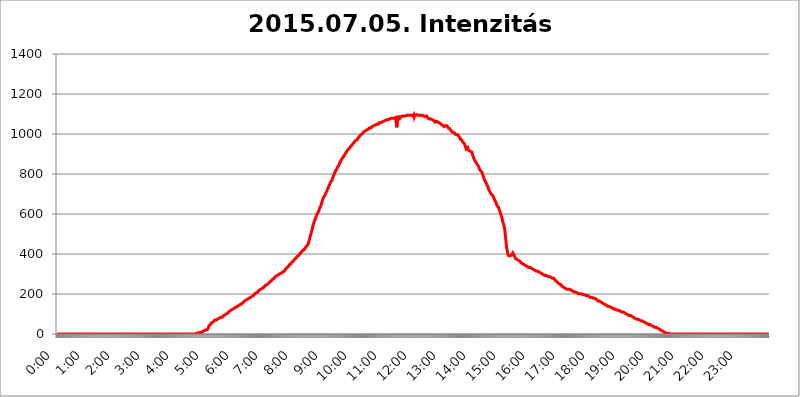
| Category | 2015.07.05. Intenzitás [W/m^2] |
|---|---|
| 0.0 | 0 |
| 0.0006944444444444445 | 0 |
| 0.001388888888888889 | 0 |
| 0.0020833333333333333 | 0 |
| 0.002777777777777778 | 0 |
| 0.003472222222222222 | 0 |
| 0.004166666666666667 | 0 |
| 0.004861111111111111 | 0 |
| 0.005555555555555556 | 0 |
| 0.0062499999999999995 | 0 |
| 0.006944444444444444 | 0 |
| 0.007638888888888889 | 0 |
| 0.008333333333333333 | 0 |
| 0.009027777777777779 | 0 |
| 0.009722222222222222 | 0 |
| 0.010416666666666666 | 0 |
| 0.011111111111111112 | 0 |
| 0.011805555555555555 | 0 |
| 0.012499999999999999 | 0 |
| 0.013194444444444444 | 0 |
| 0.013888888888888888 | 0 |
| 0.014583333333333332 | 0 |
| 0.015277777777777777 | 0 |
| 0.015972222222222224 | 0 |
| 0.016666666666666666 | 0 |
| 0.017361111111111112 | 0 |
| 0.018055555555555557 | 0 |
| 0.01875 | 0 |
| 0.019444444444444445 | 0 |
| 0.02013888888888889 | 0 |
| 0.020833333333333332 | 0 |
| 0.02152777777777778 | 0 |
| 0.022222222222222223 | 0 |
| 0.02291666666666667 | 0 |
| 0.02361111111111111 | 0 |
| 0.024305555555555556 | 0 |
| 0.024999999999999998 | 0 |
| 0.025694444444444447 | 0 |
| 0.02638888888888889 | 0 |
| 0.027083333333333334 | 0 |
| 0.027777777777777776 | 0 |
| 0.02847222222222222 | 0 |
| 0.029166666666666664 | 0 |
| 0.029861111111111113 | 0 |
| 0.030555555555555555 | 0 |
| 0.03125 | 0 |
| 0.03194444444444445 | 0 |
| 0.03263888888888889 | 0 |
| 0.03333333333333333 | 0 |
| 0.034027777777777775 | 0 |
| 0.034722222222222224 | 0 |
| 0.035416666666666666 | 0 |
| 0.036111111111111115 | 0 |
| 0.03680555555555556 | 0 |
| 0.0375 | 0 |
| 0.03819444444444444 | 0 |
| 0.03888888888888889 | 0 |
| 0.03958333333333333 | 0 |
| 0.04027777777777778 | 0 |
| 0.04097222222222222 | 0 |
| 0.041666666666666664 | 0 |
| 0.042361111111111106 | 0 |
| 0.04305555555555556 | 0 |
| 0.043750000000000004 | 0 |
| 0.044444444444444446 | 0 |
| 0.04513888888888889 | 0 |
| 0.04583333333333334 | 0 |
| 0.04652777777777778 | 0 |
| 0.04722222222222222 | 0 |
| 0.04791666666666666 | 0 |
| 0.04861111111111111 | 0 |
| 0.049305555555555554 | 0 |
| 0.049999999999999996 | 0 |
| 0.05069444444444445 | 0 |
| 0.051388888888888894 | 0 |
| 0.052083333333333336 | 0 |
| 0.05277777777777778 | 0 |
| 0.05347222222222222 | 0 |
| 0.05416666666666667 | 0 |
| 0.05486111111111111 | 0 |
| 0.05555555555555555 | 0 |
| 0.05625 | 0 |
| 0.05694444444444444 | 0 |
| 0.057638888888888885 | 0 |
| 0.05833333333333333 | 0 |
| 0.05902777777777778 | 0 |
| 0.059722222222222225 | 0 |
| 0.06041666666666667 | 0 |
| 0.061111111111111116 | 0 |
| 0.06180555555555556 | 0 |
| 0.0625 | 0 |
| 0.06319444444444444 | 0 |
| 0.06388888888888888 | 0 |
| 0.06458333333333334 | 0 |
| 0.06527777777777778 | 0 |
| 0.06597222222222222 | 0 |
| 0.06666666666666667 | 0 |
| 0.06736111111111111 | 0 |
| 0.06805555555555555 | 0 |
| 0.06874999999999999 | 0 |
| 0.06944444444444443 | 0 |
| 0.07013888888888889 | 0 |
| 0.07083333333333333 | 0 |
| 0.07152777777777779 | 0 |
| 0.07222222222222223 | 0 |
| 0.07291666666666667 | 0 |
| 0.07361111111111111 | 0 |
| 0.07430555555555556 | 0 |
| 0.075 | 0 |
| 0.07569444444444444 | 0 |
| 0.0763888888888889 | 0 |
| 0.07708333333333334 | 0 |
| 0.07777777777777778 | 0 |
| 0.07847222222222222 | 0 |
| 0.07916666666666666 | 0 |
| 0.0798611111111111 | 0 |
| 0.08055555555555556 | 0 |
| 0.08125 | 0 |
| 0.08194444444444444 | 0 |
| 0.08263888888888889 | 0 |
| 0.08333333333333333 | 0 |
| 0.08402777777777777 | 0 |
| 0.08472222222222221 | 0 |
| 0.08541666666666665 | 0 |
| 0.08611111111111112 | 0 |
| 0.08680555555555557 | 0 |
| 0.08750000000000001 | 0 |
| 0.08819444444444445 | 0 |
| 0.08888888888888889 | 0 |
| 0.08958333333333333 | 0 |
| 0.09027777777777778 | 0 |
| 0.09097222222222222 | 0 |
| 0.09166666666666667 | 0 |
| 0.09236111111111112 | 0 |
| 0.09305555555555556 | 0 |
| 0.09375 | 0 |
| 0.09444444444444444 | 0 |
| 0.09513888888888888 | 0 |
| 0.09583333333333333 | 0 |
| 0.09652777777777777 | 0 |
| 0.09722222222222222 | 0 |
| 0.09791666666666667 | 0 |
| 0.09861111111111111 | 0 |
| 0.09930555555555555 | 0 |
| 0.09999999999999999 | 0 |
| 0.10069444444444443 | 0 |
| 0.1013888888888889 | 0 |
| 0.10208333333333335 | 0 |
| 0.10277777777777779 | 0 |
| 0.10347222222222223 | 0 |
| 0.10416666666666667 | 0 |
| 0.10486111111111111 | 0 |
| 0.10555555555555556 | 0 |
| 0.10625 | 0 |
| 0.10694444444444444 | 0 |
| 0.1076388888888889 | 0 |
| 0.10833333333333334 | 0 |
| 0.10902777777777778 | 0 |
| 0.10972222222222222 | 0 |
| 0.1111111111111111 | 0 |
| 0.11180555555555556 | 0 |
| 0.11180555555555556 | 0 |
| 0.1125 | 0 |
| 0.11319444444444444 | 0 |
| 0.11388888888888889 | 0 |
| 0.11458333333333333 | 0 |
| 0.11527777777777777 | 0 |
| 0.11597222222222221 | 0 |
| 0.11666666666666665 | 0 |
| 0.1173611111111111 | 0 |
| 0.11805555555555557 | 0 |
| 0.11944444444444445 | 0 |
| 0.12013888888888889 | 0 |
| 0.12083333333333333 | 0 |
| 0.12152777777777778 | 0 |
| 0.12222222222222223 | 0 |
| 0.12291666666666667 | 0 |
| 0.12291666666666667 | 0 |
| 0.12361111111111112 | 0 |
| 0.12430555555555556 | 0 |
| 0.125 | 0 |
| 0.12569444444444444 | 0 |
| 0.12638888888888888 | 0 |
| 0.12708333333333333 | 0 |
| 0.16875 | 0 |
| 0.12847222222222224 | 0 |
| 0.12916666666666668 | 0 |
| 0.12986111111111112 | 0 |
| 0.13055555555555556 | 0 |
| 0.13125 | 0 |
| 0.13194444444444445 | 0 |
| 0.1326388888888889 | 0 |
| 0.13333333333333333 | 0 |
| 0.13402777777777777 | 0 |
| 0.13402777777777777 | 0 |
| 0.13472222222222222 | 0 |
| 0.13541666666666666 | 0 |
| 0.1361111111111111 | 0 |
| 0.13749999999999998 | 0 |
| 0.13819444444444443 | 0 |
| 0.1388888888888889 | 0 |
| 0.13958333333333334 | 0 |
| 0.14027777777777778 | 0 |
| 0.14097222222222222 | 0 |
| 0.14166666666666666 | 0 |
| 0.1423611111111111 | 0 |
| 0.14305555555555557 | 0 |
| 0.14375000000000002 | 0 |
| 0.14444444444444446 | 0 |
| 0.1451388888888889 | 0 |
| 0.1451388888888889 | 0 |
| 0.14652777777777778 | 0 |
| 0.14722222222222223 | 0 |
| 0.14791666666666667 | 0 |
| 0.1486111111111111 | 0 |
| 0.14930555555555555 | 0 |
| 0.15 | 0 |
| 0.15069444444444444 | 0 |
| 0.15138888888888888 | 0 |
| 0.15208333333333332 | 0 |
| 0.15277777777777776 | 0 |
| 0.15347222222222223 | 0 |
| 0.15416666666666667 | 0 |
| 0.15486111111111112 | 0 |
| 0.15555555555555556 | 0 |
| 0.15625 | 0 |
| 0.15694444444444444 | 0 |
| 0.15763888888888888 | 0 |
| 0.15833333333333333 | 0 |
| 0.15902777777777777 | 0 |
| 0.15972222222222224 | 0 |
| 0.16041666666666668 | 0 |
| 0.16111111111111112 | 0 |
| 0.16180555555555556 | 0 |
| 0.1625 | 0 |
| 0.16319444444444445 | 0 |
| 0.1638888888888889 | 0 |
| 0.16458333333333333 | 0 |
| 0.16527777777777777 | 0 |
| 0.16597222222222222 | 0 |
| 0.16666666666666666 | 0 |
| 0.1673611111111111 | 0 |
| 0.16805555555555554 | 0 |
| 0.16874999999999998 | 0 |
| 0.16944444444444443 | 0 |
| 0.17013888888888887 | 0 |
| 0.1708333333333333 | 0 |
| 0.17152777777777775 | 0 |
| 0.17222222222222225 | 0 |
| 0.1729166666666667 | 0 |
| 0.17361111111111113 | 0 |
| 0.17430555555555557 | 0 |
| 0.17500000000000002 | 0 |
| 0.17569444444444446 | 0 |
| 0.1763888888888889 | 0 |
| 0.17708333333333334 | 0 |
| 0.17777777777777778 | 0 |
| 0.17847222222222223 | 0 |
| 0.17916666666666667 | 0 |
| 0.1798611111111111 | 0 |
| 0.18055555555555555 | 0 |
| 0.18125 | 0 |
| 0.18194444444444444 | 0 |
| 0.1826388888888889 | 0 |
| 0.18333333333333335 | 0 |
| 0.1840277777777778 | 0 |
| 0.18472222222222223 | 0 |
| 0.18541666666666667 | 0 |
| 0.18611111111111112 | 0 |
| 0.18680555555555556 | 0 |
| 0.1875 | 0 |
| 0.18819444444444444 | 0 |
| 0.18888888888888888 | 0 |
| 0.18958333333333333 | 0 |
| 0.19027777777777777 | 0 |
| 0.1909722222222222 | 0 |
| 0.19166666666666665 | 0 |
| 0.19236111111111112 | 0 |
| 0.19305555555555554 | 0 |
| 0.19375 | 0 |
| 0.19444444444444445 | 3.525 |
| 0.1951388888888889 | 3.525 |
| 0.19583333333333333 | 3.525 |
| 0.19652777777777777 | 3.525 |
| 0.19722222222222222 | 3.525 |
| 0.19791666666666666 | 3.525 |
| 0.1986111111111111 | 3.525 |
| 0.19930555555555554 | 3.525 |
| 0.19999999999999998 | 7.887 |
| 0.20069444444444443 | 7.887 |
| 0.20138888888888887 | 7.887 |
| 0.2020833333333333 | 7.887 |
| 0.2027777777777778 | 12.257 |
| 0.2034722222222222 | 12.257 |
| 0.2041666666666667 | 12.257 |
| 0.20486111111111113 | 12.257 |
| 0.20555555555555557 | 12.257 |
| 0.20625000000000002 | 16.636 |
| 0.20694444444444446 | 16.636 |
| 0.2076388888888889 | 16.636 |
| 0.20833333333333334 | 21.024 |
| 0.20902777777777778 | 21.024 |
| 0.20972222222222223 | 21.024 |
| 0.21041666666666667 | 21.024 |
| 0.2111111111111111 | 25.419 |
| 0.21180555555555555 | 29.823 |
| 0.2125 | 38.653 |
| 0.21319444444444444 | 43.079 |
| 0.2138888888888889 | 43.079 |
| 0.21458333333333335 | 47.511 |
| 0.2152777777777778 | 47.511 |
| 0.21597222222222223 | 51.951 |
| 0.21666666666666667 | 56.398 |
| 0.21736111111111112 | 56.398 |
| 0.21805555555555556 | 60.85 |
| 0.21875 | 60.85 |
| 0.21944444444444444 | 65.31 |
| 0.22013888888888888 | 65.31 |
| 0.22083333333333333 | 69.775 |
| 0.22152777777777777 | 69.775 |
| 0.2222222222222222 | 69.775 |
| 0.22291666666666665 | 69.775 |
| 0.2236111111111111 | 74.246 |
| 0.22430555555555556 | 74.246 |
| 0.225 | 74.246 |
| 0.22569444444444445 | 74.246 |
| 0.2263888888888889 | 78.722 |
| 0.22708333333333333 | 78.722 |
| 0.22777777777777777 | 78.722 |
| 0.22847222222222222 | 78.722 |
| 0.22916666666666666 | 83.205 |
| 0.2298611111111111 | 83.205 |
| 0.23055555555555554 | 83.205 |
| 0.23124999999999998 | 83.205 |
| 0.23194444444444443 | 87.692 |
| 0.23263888888888887 | 87.692 |
| 0.2333333333333333 | 92.184 |
| 0.2340277777777778 | 92.184 |
| 0.2347222222222222 | 92.184 |
| 0.2354166666666667 | 96.682 |
| 0.23611111111111113 | 96.682 |
| 0.23680555555555557 | 101.184 |
| 0.23750000000000002 | 101.184 |
| 0.23819444444444446 | 105.69 |
| 0.2388888888888889 | 105.69 |
| 0.23958333333333334 | 105.69 |
| 0.24027777777777778 | 110.201 |
| 0.24097222222222223 | 110.201 |
| 0.24166666666666667 | 114.716 |
| 0.2423611111111111 | 114.716 |
| 0.24305555555555555 | 119.235 |
| 0.24375 | 119.235 |
| 0.24444444444444446 | 119.235 |
| 0.24513888888888888 | 119.235 |
| 0.24583333333333335 | 123.758 |
| 0.2465277777777778 | 123.758 |
| 0.24722222222222223 | 123.758 |
| 0.24791666666666667 | 128.284 |
| 0.24861111111111112 | 128.284 |
| 0.24930555555555556 | 128.284 |
| 0.25 | 132.814 |
| 0.25069444444444444 | 132.814 |
| 0.2513888888888889 | 137.347 |
| 0.2520833333333333 | 137.347 |
| 0.25277777777777777 | 137.347 |
| 0.2534722222222222 | 141.884 |
| 0.25416666666666665 | 141.884 |
| 0.2548611111111111 | 146.423 |
| 0.2555555555555556 | 146.423 |
| 0.25625000000000003 | 146.423 |
| 0.2569444444444445 | 150.964 |
| 0.2576388888888889 | 150.964 |
| 0.25833333333333336 | 150.964 |
| 0.2590277777777778 | 155.509 |
| 0.25972222222222224 | 155.509 |
| 0.2604166666666667 | 155.509 |
| 0.2611111111111111 | 160.056 |
| 0.26180555555555557 | 160.056 |
| 0.2625 | 164.605 |
| 0.26319444444444445 | 164.605 |
| 0.2638888888888889 | 164.605 |
| 0.26458333333333334 | 169.156 |
| 0.2652777777777778 | 169.156 |
| 0.2659722222222222 | 169.156 |
| 0.26666666666666666 | 173.709 |
| 0.2673611111111111 | 173.709 |
| 0.26805555555555555 | 173.709 |
| 0.26875 | 178.264 |
| 0.26944444444444443 | 178.264 |
| 0.2701388888888889 | 182.82 |
| 0.2708333333333333 | 182.82 |
| 0.27152777777777776 | 182.82 |
| 0.2722222222222222 | 182.82 |
| 0.27291666666666664 | 187.378 |
| 0.2736111111111111 | 191.937 |
| 0.2743055555555555 | 191.937 |
| 0.27499999999999997 | 191.937 |
| 0.27569444444444446 | 196.497 |
| 0.27638888888888885 | 196.497 |
| 0.27708333333333335 | 201.058 |
| 0.2777777777777778 | 201.058 |
| 0.27847222222222223 | 201.058 |
| 0.2791666666666667 | 205.62 |
| 0.2798611111111111 | 205.62 |
| 0.28055555555555556 | 210.182 |
| 0.28125 | 210.182 |
| 0.28194444444444444 | 214.746 |
| 0.2826388888888889 | 214.746 |
| 0.2833333333333333 | 219.309 |
| 0.28402777777777777 | 219.309 |
| 0.2847222222222222 | 219.309 |
| 0.28541666666666665 | 223.873 |
| 0.28611111111111115 | 223.873 |
| 0.28680555555555554 | 228.436 |
| 0.28750000000000003 | 228.436 |
| 0.2881944444444445 | 233 |
| 0.2888888888888889 | 233 |
| 0.28958333333333336 | 233 |
| 0.2902777777777778 | 237.564 |
| 0.29097222222222224 | 237.564 |
| 0.2916666666666667 | 242.127 |
| 0.2923611111111111 | 242.127 |
| 0.29305555555555557 | 246.689 |
| 0.29375 | 246.689 |
| 0.29444444444444445 | 246.689 |
| 0.2951388888888889 | 251.251 |
| 0.29583333333333334 | 251.251 |
| 0.2965277777777778 | 255.813 |
| 0.2972222222222222 | 255.813 |
| 0.29791666666666666 | 260.373 |
| 0.2986111111111111 | 260.373 |
| 0.29930555555555555 | 264.932 |
| 0.3 | 264.932 |
| 0.30069444444444443 | 269.49 |
| 0.3013888888888889 | 269.49 |
| 0.3020833333333333 | 274.047 |
| 0.30277777777777776 | 274.047 |
| 0.3034722222222222 | 278.603 |
| 0.30416666666666664 | 278.603 |
| 0.3048611111111111 | 283.156 |
| 0.3055555555555555 | 283.156 |
| 0.30624999999999997 | 287.709 |
| 0.3069444444444444 | 287.709 |
| 0.3076388888888889 | 287.709 |
| 0.30833333333333335 | 292.259 |
| 0.3090277777777778 | 292.259 |
| 0.30972222222222223 | 292.259 |
| 0.3104166666666667 | 296.808 |
| 0.3111111111111111 | 296.808 |
| 0.31180555555555556 | 296.808 |
| 0.3125 | 301.354 |
| 0.31319444444444444 | 301.354 |
| 0.3138888888888889 | 305.898 |
| 0.3145833333333333 | 305.898 |
| 0.31527777777777777 | 305.898 |
| 0.3159722222222222 | 310.44 |
| 0.31666666666666665 | 310.44 |
| 0.31736111111111115 | 314.98 |
| 0.31805555555555554 | 314.98 |
| 0.31875000000000003 | 314.98 |
| 0.3194444444444445 | 319.517 |
| 0.3201388888888889 | 324.052 |
| 0.32083333333333336 | 324.052 |
| 0.3215277777777778 | 328.584 |
| 0.32222222222222224 | 333.113 |
| 0.3229166666666667 | 333.113 |
| 0.3236111111111111 | 337.639 |
| 0.32430555555555557 | 337.639 |
| 0.325 | 342.162 |
| 0.32569444444444445 | 346.682 |
| 0.3263888888888889 | 346.682 |
| 0.32708333333333334 | 351.198 |
| 0.3277777777777778 | 351.198 |
| 0.3284722222222222 | 355.712 |
| 0.32916666666666666 | 360.221 |
| 0.3298611111111111 | 360.221 |
| 0.33055555555555555 | 364.728 |
| 0.33125 | 364.728 |
| 0.33194444444444443 | 369.23 |
| 0.3326388888888889 | 373.729 |
| 0.3333333333333333 | 378.224 |
| 0.3340277777777778 | 378.224 |
| 0.3347222222222222 | 378.224 |
| 0.3354166666666667 | 382.715 |
| 0.3361111111111111 | 387.202 |
| 0.3368055555555556 | 387.202 |
| 0.33749999999999997 | 391.685 |
| 0.33819444444444446 | 391.685 |
| 0.33888888888888885 | 396.164 |
| 0.33958333333333335 | 396.164 |
| 0.34027777777777773 | 400.638 |
| 0.34097222222222223 | 405.108 |
| 0.3416666666666666 | 405.108 |
| 0.3423611111111111 | 409.574 |
| 0.3430555555555555 | 414.035 |
| 0.34375 | 414.035 |
| 0.3444444444444445 | 418.492 |
| 0.3451388888888889 | 418.492 |
| 0.3458333333333334 | 422.943 |
| 0.34652777777777777 | 422.943 |
| 0.34722222222222227 | 427.39 |
| 0.34791666666666665 | 431.833 |
| 0.34861111111111115 | 431.833 |
| 0.34930555555555554 | 436.27 |
| 0.35000000000000003 | 440.702 |
| 0.3506944444444444 | 440.702 |
| 0.3513888888888889 | 445.129 |
| 0.3520833333333333 | 449.551 |
| 0.3527777777777778 | 462.786 |
| 0.3534722222222222 | 467.187 |
| 0.3541666666666667 | 475.972 |
| 0.3548611111111111 | 489.108 |
| 0.35555555555555557 | 497.836 |
| 0.35625 | 506.542 |
| 0.35694444444444445 | 515.223 |
| 0.3576388888888889 | 523.88 |
| 0.35833333333333334 | 536.82 |
| 0.3590277777777778 | 545.416 |
| 0.3597222222222222 | 553.986 |
| 0.36041666666666666 | 562.53 |
| 0.3611111111111111 | 566.793 |
| 0.36180555555555555 | 575.299 |
| 0.3625 | 579.542 |
| 0.36319444444444443 | 588.009 |
| 0.3638888888888889 | 592.233 |
| 0.3645833333333333 | 600.661 |
| 0.3652777777777778 | 600.661 |
| 0.3659722222222222 | 604.864 |
| 0.3666666666666667 | 613.252 |
| 0.3673611111111111 | 621.613 |
| 0.3680555555555556 | 629.948 |
| 0.36874999999999997 | 634.105 |
| 0.36944444444444446 | 638.256 |
| 0.37013888888888885 | 634.105 |
| 0.37083333333333335 | 654.791 |
| 0.37152777777777773 | 663.019 |
| 0.37222222222222223 | 671.22 |
| 0.3729166666666666 | 679.395 |
| 0.3736111111111111 | 683.473 |
| 0.3743055555555555 | 687.544 |
| 0.375 | 691.608 |
| 0.3756944444444445 | 695.666 |
| 0.3763888888888889 | 703.762 |
| 0.3770833333333334 | 707.8 |
| 0.37777777777777777 | 711.832 |
| 0.37847222222222227 | 715.858 |
| 0.37916666666666665 | 723.889 |
| 0.37986111111111115 | 727.896 |
| 0.38055555555555554 | 735.89 |
| 0.38125000000000003 | 735.89 |
| 0.3819444444444444 | 747.834 |
| 0.3826388888888889 | 751.803 |
| 0.3833333333333333 | 759.723 |
| 0.3840277777777778 | 759.723 |
| 0.3847222222222222 | 759.723 |
| 0.3854166666666667 | 767.62 |
| 0.3861111111111111 | 779.42 |
| 0.38680555555555557 | 783.342 |
| 0.3875 | 791.169 |
| 0.38819444444444445 | 795.074 |
| 0.3888888888888889 | 802.868 |
| 0.38958333333333334 | 806.757 |
| 0.3902777777777778 | 814.519 |
| 0.3909722222222222 | 818.392 |
| 0.39166666666666666 | 822.26 |
| 0.3923611111111111 | 829.981 |
| 0.39305555555555555 | 833.834 |
| 0.39375 | 837.682 |
| 0.39444444444444443 | 841.526 |
| 0.3951388888888889 | 845.365 |
| 0.3958333333333333 | 853.029 |
| 0.3965277777777778 | 856.855 |
| 0.3972222222222222 | 860.676 |
| 0.3979166666666667 | 868.305 |
| 0.3986111111111111 | 872.114 |
| 0.3993055555555556 | 875.918 |
| 0.39999999999999997 | 879.719 |
| 0.40069444444444446 | 883.516 |
| 0.40138888888888885 | 887.309 |
| 0.40208333333333335 | 891.099 |
| 0.40277777777777773 | 894.885 |
| 0.40347222222222223 | 898.668 |
| 0.4041666666666666 | 902.447 |
| 0.4048611111111111 | 906.223 |
| 0.4055555555555555 | 909.996 |
| 0.40625 | 913.766 |
| 0.4069444444444445 | 917.534 |
| 0.4076388888888889 | 921.298 |
| 0.4083333333333334 | 925.06 |
| 0.40902777777777777 | 925.06 |
| 0.40972222222222227 | 928.819 |
| 0.41041666666666665 | 932.576 |
| 0.41111111111111115 | 936.33 |
| 0.41180555555555554 | 936.33 |
| 0.41250000000000003 | 940.082 |
| 0.4131944444444444 | 943.832 |
| 0.4138888888888889 | 947.58 |
| 0.4145833333333333 | 951.327 |
| 0.4152777777777778 | 955.071 |
| 0.4159722222222222 | 955.071 |
| 0.4166666666666667 | 958.814 |
| 0.4173611111111111 | 962.555 |
| 0.41805555555555557 | 966.295 |
| 0.41875 | 966.295 |
| 0.41944444444444445 | 970.034 |
| 0.4201388888888889 | 970.034 |
| 0.42083333333333334 | 973.772 |
| 0.4215277777777778 | 977.508 |
| 0.4222222222222222 | 981.244 |
| 0.42291666666666666 | 984.98 |
| 0.4236111111111111 | 988.714 |
| 0.42430555555555555 | 988.714 |
| 0.425 | 992.448 |
| 0.42569444444444443 | 992.448 |
| 0.4263888888888889 | 996.182 |
| 0.4270833333333333 | 999.916 |
| 0.4277777777777778 | 999.916 |
| 0.4284722222222222 | 1003.65 |
| 0.4291666666666667 | 1007.383 |
| 0.4298611111111111 | 1007.383 |
| 0.4305555555555556 | 1011.118 |
| 0.43124999999999997 | 1014.852 |
| 0.43194444444444446 | 1014.852 |
| 0.43263888888888885 | 1018.587 |
| 0.43333333333333335 | 1018.587 |
| 0.43402777777777773 | 1022.323 |
| 0.43472222222222223 | 1022.323 |
| 0.4354166666666666 | 1022.323 |
| 0.4361111111111111 | 1026.06 |
| 0.4368055555555555 | 1026.06 |
| 0.4375 | 1029.798 |
| 0.4381944444444445 | 1029.798 |
| 0.4388888888888889 | 1029.798 |
| 0.4395833333333334 | 1029.798 |
| 0.44027777777777777 | 1033.537 |
| 0.44097222222222227 | 1033.537 |
| 0.44166666666666665 | 1037.277 |
| 0.44236111111111115 | 1037.277 |
| 0.44305555555555554 | 1037.277 |
| 0.44375000000000003 | 1041.019 |
| 0.4444444444444444 | 1041.019 |
| 0.4451388888888889 | 1044.762 |
| 0.4458333333333333 | 1044.762 |
| 0.4465277777777778 | 1044.762 |
| 0.4472222222222222 | 1044.762 |
| 0.4479166666666667 | 1048.508 |
| 0.4486111111111111 | 1048.508 |
| 0.44930555555555557 | 1048.508 |
| 0.45 | 1048.508 |
| 0.45069444444444445 | 1052.255 |
| 0.4513888888888889 | 1056.004 |
| 0.45208333333333334 | 1056.004 |
| 0.4527777777777778 | 1056.004 |
| 0.4534722222222222 | 1056.004 |
| 0.45416666666666666 | 1059.756 |
| 0.4548611111111111 | 1059.756 |
| 0.45555555555555555 | 1059.756 |
| 0.45625 | 1063.51 |
| 0.45694444444444443 | 1063.51 |
| 0.4576388888888889 | 1063.51 |
| 0.4583333333333333 | 1063.51 |
| 0.4590277777777778 | 1067.267 |
| 0.4597222222222222 | 1067.267 |
| 0.4604166666666667 | 1071.027 |
| 0.4611111111111111 | 1071.027 |
| 0.4618055555555556 | 1071.027 |
| 0.46249999999999997 | 1071.027 |
| 0.46319444444444446 | 1071.027 |
| 0.46388888888888885 | 1071.027 |
| 0.46458333333333335 | 1071.027 |
| 0.46527777777777773 | 1074.789 |
| 0.46597222222222223 | 1074.789 |
| 0.4666666666666666 | 1074.789 |
| 0.4673611111111111 | 1078.555 |
| 0.4680555555555555 | 1078.555 |
| 0.46875 | 1078.555 |
| 0.4694444444444445 | 1078.555 |
| 0.4701388888888889 | 1078.555 |
| 0.4708333333333334 | 1078.555 |
| 0.47152777777777777 | 1078.555 |
| 0.47222222222222227 | 1078.555 |
| 0.47291666666666665 | 1082.324 |
| 0.47361111111111115 | 1082.324 |
| 0.47430555555555554 | 1082.324 |
| 0.47500000000000003 | 1086.097 |
| 0.4756944444444444 | 1082.324 |
| 0.4763888888888889 | 1033.537 |
| 0.4770833333333333 | 1082.324 |
| 0.4777777777777778 | 1086.097 |
| 0.4784722222222222 | 1086.097 |
| 0.4791666666666667 | 1086.097 |
| 0.4798611111111111 | 1086.097 |
| 0.48055555555555557 | 1078.555 |
| 0.48125 | 1078.555 |
| 0.48194444444444445 | 1086.097 |
| 0.4826388888888889 | 1089.873 |
| 0.48333333333333334 | 1089.873 |
| 0.4840277777777778 | 1089.873 |
| 0.4847222222222222 | 1086.097 |
| 0.48541666666666666 | 1089.873 |
| 0.4861111111111111 | 1089.873 |
| 0.48680555555555555 | 1089.873 |
| 0.4875 | 1089.873 |
| 0.48819444444444443 | 1089.873 |
| 0.4888888888888889 | 1089.873 |
| 0.4895833333333333 | 1093.653 |
| 0.4902777777777778 | 1093.653 |
| 0.4909722222222222 | 1093.653 |
| 0.4916666666666667 | 1093.653 |
| 0.4923611111111111 | 1093.653 |
| 0.4930555555555556 | 1093.653 |
| 0.49374999999999997 | 1093.653 |
| 0.49444444444444446 | 1093.653 |
| 0.49513888888888885 | 1097.437 |
| 0.49583333333333335 | 1093.653 |
| 0.49652777777777773 | 1093.653 |
| 0.49722222222222223 | 1097.437 |
| 0.4979166666666666 | 1093.653 |
| 0.4986111111111111 | 1089.873 |
| 0.4993055555555555 | 1089.873 |
| 0.5 | 1097.437 |
| 0.5006944444444444 | 1086.097 |
| 0.5013888888888889 | 1093.653 |
| 0.5020833333333333 | 1093.653 |
| 0.5027777777777778 | 1097.437 |
| 0.5034722222222222 | 1097.437 |
| 0.5041666666666667 | 1097.437 |
| 0.5048611111111111 | 1097.437 |
| 0.5055555555555555 | 1093.653 |
| 0.50625 | 1093.653 |
| 0.5069444444444444 | 1093.653 |
| 0.5076388888888889 | 1093.653 |
| 0.5083333333333333 | 1093.653 |
| 0.5090277777777777 | 1093.653 |
| 0.5097222222222222 | 1093.653 |
| 0.5104166666666666 | 1093.653 |
| 0.5111111111111112 | 1093.653 |
| 0.5118055555555555 | 1093.653 |
| 0.5125000000000001 | 1093.653 |
| 0.5131944444444444 | 1093.653 |
| 0.513888888888889 | 1089.873 |
| 0.5145833333333333 | 1089.873 |
| 0.5152777777777778 | 1086.097 |
| 0.5159722222222222 | 1086.097 |
| 0.5166666666666667 | 1086.097 |
| 0.517361111111111 | 1086.097 |
| 0.5180555555555556 | 1089.873 |
| 0.5187499999999999 | 1086.097 |
| 0.5194444444444445 | 1086.097 |
| 0.5201388888888888 | 1078.555 |
| 0.5208333333333334 | 1078.555 |
| 0.5215277777777778 | 1074.789 |
| 0.5222222222222223 | 1074.789 |
| 0.5229166666666667 | 1074.789 |
| 0.5236111111111111 | 1071.027 |
| 0.5243055555555556 | 1074.789 |
| 0.525 | 1074.789 |
| 0.5256944444444445 | 1071.027 |
| 0.5263888888888889 | 1071.027 |
| 0.5270833333333333 | 1071.027 |
| 0.5277777777777778 | 1071.027 |
| 0.5284722222222222 | 1067.267 |
| 0.5291666666666667 | 1063.51 |
| 0.5298611111111111 | 1059.756 |
| 0.5305555555555556 | 1059.756 |
| 0.53125 | 1059.756 |
| 0.5319444444444444 | 1063.51 |
| 0.5326388888888889 | 1059.756 |
| 0.5333333333333333 | 1059.756 |
| 0.5340277777777778 | 1059.756 |
| 0.5347222222222222 | 1056.004 |
| 0.5354166666666667 | 1056.004 |
| 0.5361111111111111 | 1056.004 |
| 0.5368055555555555 | 1052.255 |
| 0.5375 | 1052.255 |
| 0.5381944444444444 | 1048.508 |
| 0.5388888888888889 | 1048.508 |
| 0.5395833333333333 | 1044.762 |
| 0.5402777777777777 | 1044.762 |
| 0.5409722222222222 | 1048.508 |
| 0.5416666666666666 | 1041.019 |
| 0.5423611111111112 | 1037.277 |
| 0.5430555555555555 | 1037.277 |
| 0.5437500000000001 | 1041.019 |
| 0.5444444444444444 | 1041.019 |
| 0.545138888888889 | 1041.019 |
| 0.5458333333333333 | 1041.019 |
| 0.5465277777777778 | 1041.019 |
| 0.5472222222222222 | 1041.019 |
| 0.5479166666666667 | 1037.277 |
| 0.548611111111111 | 1029.798 |
| 0.5493055555555556 | 1026.06 |
| 0.5499999999999999 | 1026.06 |
| 0.5506944444444445 | 1026.06 |
| 0.5513888888888888 | 1022.323 |
| 0.5520833333333334 | 1018.587 |
| 0.5527777777777778 | 1014.852 |
| 0.5534722222222223 | 1011.118 |
| 0.5541666666666667 | 1007.383 |
| 0.5548611111111111 | 1007.383 |
| 0.5555555555555556 | 1007.383 |
| 0.55625 | 1007.383 |
| 0.5569444444444445 | 1007.383 |
| 0.5576388888888889 | 1003.65 |
| 0.5583333333333333 | 999.916 |
| 0.5590277777777778 | 999.916 |
| 0.5597222222222222 | 996.182 |
| 0.5604166666666667 | 996.182 |
| 0.5611111111111111 | 996.182 |
| 0.5618055555555556 | 996.182 |
| 0.5625 | 992.448 |
| 0.5631944444444444 | 988.714 |
| 0.5638888888888889 | 984.98 |
| 0.5645833333333333 | 981.244 |
| 0.5652777777777778 | 973.772 |
| 0.5659722222222222 | 977.508 |
| 0.5666666666666667 | 973.772 |
| 0.5673611111111111 | 970.034 |
| 0.5680555555555555 | 962.555 |
| 0.56875 | 962.555 |
| 0.5694444444444444 | 958.814 |
| 0.5701388888888889 | 955.071 |
| 0.5708333333333333 | 951.327 |
| 0.5715277777777777 | 947.58 |
| 0.5722222222222222 | 943.832 |
| 0.5729166666666666 | 943.832 |
| 0.5736111111111112 | 925.06 |
| 0.5743055555555555 | 928.819 |
| 0.5750000000000001 | 928.819 |
| 0.5756944444444444 | 932.576 |
| 0.576388888888889 | 925.06 |
| 0.5770833333333333 | 917.534 |
| 0.5777777777777778 | 913.766 |
| 0.5784722222222222 | 917.534 |
| 0.5791666666666667 | 913.766 |
| 0.579861111111111 | 909.996 |
| 0.5805555555555556 | 909.996 |
| 0.5812499999999999 | 909.996 |
| 0.5819444444444445 | 906.223 |
| 0.5826388888888888 | 894.885 |
| 0.5833333333333334 | 887.309 |
| 0.5840277777777778 | 879.719 |
| 0.5847222222222223 | 875.918 |
| 0.5854166666666667 | 868.305 |
| 0.5861111111111111 | 864.493 |
| 0.5868055555555556 | 860.676 |
| 0.5875 | 856.855 |
| 0.5881944444444445 | 853.029 |
| 0.5888888888888889 | 849.199 |
| 0.5895833333333333 | 845.365 |
| 0.5902777777777778 | 841.526 |
| 0.5909722222222222 | 837.682 |
| 0.5916666666666667 | 829.981 |
| 0.5923611111111111 | 822.26 |
| 0.5930555555555556 | 818.392 |
| 0.59375 | 818.392 |
| 0.5944444444444444 | 814.519 |
| 0.5951388888888889 | 810.641 |
| 0.5958333333333333 | 806.757 |
| 0.5965277777777778 | 802.868 |
| 0.5972222222222222 | 791.169 |
| 0.5979166666666667 | 783.342 |
| 0.5986111111111111 | 779.42 |
| 0.5993055555555555 | 771.559 |
| 0.6 | 767.62 |
| 0.6006944444444444 | 759.723 |
| 0.6013888888888889 | 755.766 |
| 0.6020833333333333 | 751.803 |
| 0.6027777777777777 | 743.859 |
| 0.6034722222222222 | 739.877 |
| 0.6041666666666666 | 735.89 |
| 0.6048611111111112 | 723.889 |
| 0.6055555555555555 | 723.889 |
| 0.6062500000000001 | 719.877 |
| 0.6069444444444444 | 711.832 |
| 0.607638888888889 | 703.762 |
| 0.6083333333333333 | 699.717 |
| 0.6090277777777778 | 699.717 |
| 0.6097222222222222 | 695.666 |
| 0.6104166666666667 | 691.608 |
| 0.611111111111111 | 691.608 |
| 0.6118055555555556 | 687.544 |
| 0.6124999999999999 | 679.395 |
| 0.6131944444444445 | 671.22 |
| 0.6138888888888888 | 667.123 |
| 0.6145833333333334 | 663.019 |
| 0.6152777777777778 | 658.909 |
| 0.6159722222222223 | 650.667 |
| 0.6166666666666667 | 642.4 |
| 0.6173611111111111 | 642.4 |
| 0.6180555555555556 | 638.256 |
| 0.61875 | 634.105 |
| 0.6194444444444445 | 625.784 |
| 0.6201388888888889 | 621.613 |
| 0.6208333333333333 | 613.252 |
| 0.6215277777777778 | 604.864 |
| 0.6222222222222222 | 596.45 |
| 0.6229166666666667 | 592.233 |
| 0.6236111111111111 | 583.779 |
| 0.6243055555555556 | 571.049 |
| 0.625 | 558.261 |
| 0.6256944444444444 | 553.986 |
| 0.6263888888888889 | 545.416 |
| 0.6270833333333333 | 532.513 |
| 0.6277777777777778 | 519.555 |
| 0.6284722222222222 | 493.475 |
| 0.6291666666666667 | 471.582 |
| 0.6298611111111111 | 445.129 |
| 0.6305555555555555 | 427.39 |
| 0.63125 | 414.035 |
| 0.6319444444444444 | 400.638 |
| 0.6326388888888889 | 396.164 |
| 0.6333333333333333 | 391.685 |
| 0.6340277777777777 | 391.685 |
| 0.6347222222222222 | 391.685 |
| 0.6354166666666666 | 391.685 |
| 0.6361111111111112 | 396.164 |
| 0.6368055555555555 | 396.164 |
| 0.6375000000000001 | 396.164 |
| 0.6381944444444444 | 400.638 |
| 0.638888888888889 | 405.108 |
| 0.6395833333333333 | 400.638 |
| 0.6402777777777778 | 396.164 |
| 0.6409722222222222 | 396.164 |
| 0.6416666666666667 | 387.202 |
| 0.642361111111111 | 378.224 |
| 0.6430555555555556 | 378.224 |
| 0.6437499999999999 | 378.224 |
| 0.6444444444444445 | 373.729 |
| 0.6451388888888888 | 369.23 |
| 0.6458333333333334 | 369.23 |
| 0.6465277777777778 | 369.23 |
| 0.6472222222222223 | 369.23 |
| 0.6479166666666667 | 364.728 |
| 0.6486111111111111 | 364.728 |
| 0.6493055555555556 | 360.221 |
| 0.65 | 360.221 |
| 0.6506944444444445 | 355.712 |
| 0.6513888888888889 | 355.712 |
| 0.6520833333333333 | 351.198 |
| 0.6527777777777778 | 351.198 |
| 0.6534722222222222 | 351.198 |
| 0.6541666666666667 | 346.682 |
| 0.6548611111111111 | 346.682 |
| 0.6555555555555556 | 346.682 |
| 0.65625 | 342.162 |
| 0.6569444444444444 | 342.162 |
| 0.6576388888888889 | 342.162 |
| 0.6583333333333333 | 337.639 |
| 0.6590277777777778 | 337.639 |
| 0.6597222222222222 | 337.639 |
| 0.6604166666666667 | 337.639 |
| 0.6611111111111111 | 333.113 |
| 0.6618055555555555 | 333.113 |
| 0.6625 | 333.113 |
| 0.6631944444444444 | 333.113 |
| 0.6638888888888889 | 328.584 |
| 0.6645833333333333 | 328.584 |
| 0.6652777777777777 | 328.584 |
| 0.6659722222222222 | 328.584 |
| 0.6666666666666666 | 324.052 |
| 0.6673611111111111 | 324.052 |
| 0.6680555555555556 | 324.052 |
| 0.6687500000000001 | 324.052 |
| 0.6694444444444444 | 319.517 |
| 0.6701388888888888 | 319.517 |
| 0.6708333333333334 | 314.98 |
| 0.6715277777777778 | 314.98 |
| 0.6722222222222222 | 314.98 |
| 0.6729166666666666 | 314.98 |
| 0.6736111111111112 | 314.98 |
| 0.6743055555555556 | 310.44 |
| 0.6749999999999999 | 310.44 |
| 0.6756944444444444 | 310.44 |
| 0.6763888888888889 | 305.898 |
| 0.6770833333333334 | 305.898 |
| 0.6777777777777777 | 305.898 |
| 0.6784722222222223 | 305.898 |
| 0.6791666666666667 | 301.354 |
| 0.6798611111111111 | 301.354 |
| 0.6805555555555555 | 301.354 |
| 0.68125 | 296.808 |
| 0.6819444444444445 | 296.808 |
| 0.6826388888888889 | 292.259 |
| 0.6833333333333332 | 292.259 |
| 0.6840277777777778 | 292.259 |
| 0.6847222222222222 | 292.259 |
| 0.6854166666666667 | 292.259 |
| 0.686111111111111 | 292.259 |
| 0.6868055555555556 | 287.709 |
| 0.6875 | 287.709 |
| 0.6881944444444444 | 287.709 |
| 0.688888888888889 | 287.709 |
| 0.6895833333333333 | 287.709 |
| 0.6902777777777778 | 287.709 |
| 0.6909722222222222 | 287.709 |
| 0.6916666666666668 | 283.156 |
| 0.6923611111111111 | 283.156 |
| 0.6930555555555555 | 283.156 |
| 0.69375 | 283.156 |
| 0.6944444444444445 | 278.603 |
| 0.6951388888888889 | 278.603 |
| 0.6958333333333333 | 278.603 |
| 0.6965277777777777 | 278.603 |
| 0.6972222222222223 | 274.047 |
| 0.6979166666666666 | 269.49 |
| 0.6986111111111111 | 269.49 |
| 0.6993055555555556 | 264.932 |
| 0.7000000000000001 | 264.932 |
| 0.7006944444444444 | 260.373 |
| 0.7013888888888888 | 260.373 |
| 0.7020833333333334 | 255.813 |
| 0.7027777777777778 | 251.251 |
| 0.7034722222222222 | 251.251 |
| 0.7041666666666666 | 251.251 |
| 0.7048611111111112 | 251.251 |
| 0.7055555555555556 | 251.251 |
| 0.7062499999999999 | 246.689 |
| 0.7069444444444444 | 246.689 |
| 0.7076388888888889 | 242.127 |
| 0.7083333333333334 | 237.564 |
| 0.7090277777777777 | 237.564 |
| 0.7097222222222223 | 237.564 |
| 0.7104166666666667 | 233 |
| 0.7111111111111111 | 233 |
| 0.7118055555555555 | 233 |
| 0.7125 | 228.436 |
| 0.7131944444444445 | 228.436 |
| 0.7138888888888889 | 228.436 |
| 0.7145833333333332 | 223.873 |
| 0.7152777777777778 | 223.873 |
| 0.7159722222222222 | 223.873 |
| 0.7166666666666667 | 223.873 |
| 0.717361111111111 | 228.436 |
| 0.7180555555555556 | 228.436 |
| 0.71875 | 223.873 |
| 0.7194444444444444 | 223.873 |
| 0.720138888888889 | 219.309 |
| 0.7208333333333333 | 219.309 |
| 0.7215277777777778 | 214.746 |
| 0.7222222222222222 | 214.746 |
| 0.7229166666666668 | 214.746 |
| 0.7236111111111111 | 210.182 |
| 0.7243055555555555 | 210.182 |
| 0.725 | 210.182 |
| 0.7256944444444445 | 210.182 |
| 0.7263888888888889 | 210.182 |
| 0.7270833333333333 | 210.182 |
| 0.7277777777777777 | 210.182 |
| 0.7284722222222223 | 205.62 |
| 0.7291666666666666 | 205.62 |
| 0.7298611111111111 | 205.62 |
| 0.7305555555555556 | 201.058 |
| 0.7312500000000001 | 201.058 |
| 0.7319444444444444 | 201.058 |
| 0.7326388888888888 | 201.058 |
| 0.7333333333333334 | 201.058 |
| 0.7340277777777778 | 201.058 |
| 0.7347222222222222 | 201.058 |
| 0.7354166666666666 | 201.058 |
| 0.7361111111111112 | 201.058 |
| 0.7368055555555556 | 196.497 |
| 0.7374999999999999 | 196.497 |
| 0.7381944444444444 | 196.497 |
| 0.7388888888888889 | 196.497 |
| 0.7395833333333334 | 196.497 |
| 0.7402777777777777 | 191.937 |
| 0.7409722222222223 | 191.937 |
| 0.7416666666666667 | 191.937 |
| 0.7423611111111111 | 191.937 |
| 0.7430555555555555 | 191.937 |
| 0.74375 | 191.937 |
| 0.7444444444444445 | 191.937 |
| 0.7451388888888889 | 191.937 |
| 0.7458333333333332 | 187.378 |
| 0.7465277777777778 | 187.378 |
| 0.7472222222222222 | 187.378 |
| 0.7479166666666667 | 182.82 |
| 0.748611111111111 | 182.82 |
| 0.7493055555555556 | 182.82 |
| 0.75 | 182.82 |
| 0.7506944444444444 | 182.82 |
| 0.751388888888889 | 182.82 |
| 0.7520833333333333 | 178.264 |
| 0.7527777777777778 | 182.82 |
| 0.7534722222222222 | 178.264 |
| 0.7541666666666668 | 178.264 |
| 0.7548611111111111 | 178.264 |
| 0.7555555555555555 | 173.709 |
| 0.75625 | 173.709 |
| 0.7569444444444445 | 169.156 |
| 0.7576388888888889 | 169.156 |
| 0.7583333333333333 | 164.605 |
| 0.7590277777777777 | 164.605 |
| 0.7597222222222223 | 164.605 |
| 0.7604166666666666 | 164.605 |
| 0.7611111111111111 | 160.056 |
| 0.7618055555555556 | 160.056 |
| 0.7625000000000001 | 160.056 |
| 0.7631944444444444 | 155.509 |
| 0.7638888888888888 | 155.509 |
| 0.7645833333333334 | 155.509 |
| 0.7652777777777778 | 155.509 |
| 0.7659722222222222 | 155.509 |
| 0.7666666666666666 | 150.964 |
| 0.7673611111111112 | 150.964 |
| 0.7680555555555556 | 150.964 |
| 0.7687499999999999 | 146.423 |
| 0.7694444444444444 | 146.423 |
| 0.7701388888888889 | 146.423 |
| 0.7708333333333334 | 141.884 |
| 0.7715277777777777 | 141.884 |
| 0.7722222222222223 | 141.884 |
| 0.7729166666666667 | 137.347 |
| 0.7736111111111111 | 137.347 |
| 0.7743055555555555 | 137.347 |
| 0.775 | 137.347 |
| 0.7756944444444445 | 132.814 |
| 0.7763888888888889 | 132.814 |
| 0.7770833333333332 | 132.814 |
| 0.7777777777777778 | 128.284 |
| 0.7784722222222222 | 128.284 |
| 0.7791666666666667 | 128.284 |
| 0.779861111111111 | 128.284 |
| 0.7805555555555556 | 128.284 |
| 0.78125 | 123.758 |
| 0.7819444444444444 | 123.758 |
| 0.782638888888889 | 123.758 |
| 0.7833333333333333 | 123.758 |
| 0.7840277777777778 | 119.235 |
| 0.7847222222222222 | 119.235 |
| 0.7854166666666668 | 119.235 |
| 0.7861111111111111 | 119.235 |
| 0.7868055555555555 | 119.235 |
| 0.7875 | 119.235 |
| 0.7881944444444445 | 119.235 |
| 0.7888888888888889 | 114.716 |
| 0.7895833333333333 | 114.716 |
| 0.7902777777777777 | 114.716 |
| 0.7909722222222223 | 110.201 |
| 0.7916666666666666 | 110.201 |
| 0.7923611111111111 | 110.201 |
| 0.7930555555555556 | 110.201 |
| 0.7937500000000001 | 110.201 |
| 0.7944444444444444 | 105.69 |
| 0.7951388888888888 | 105.69 |
| 0.7958333333333334 | 105.69 |
| 0.7965277777777778 | 101.184 |
| 0.7972222222222222 | 101.184 |
| 0.7979166666666666 | 101.184 |
| 0.7986111111111112 | 101.184 |
| 0.7993055555555556 | 101.184 |
| 0.7999999999999999 | 96.682 |
| 0.8006944444444444 | 96.682 |
| 0.8013888888888889 | 96.682 |
| 0.8020833333333334 | 92.184 |
| 0.8027777777777777 | 92.184 |
| 0.8034722222222223 | 92.184 |
| 0.8041666666666667 | 92.184 |
| 0.8048611111111111 | 87.692 |
| 0.8055555555555555 | 87.692 |
| 0.80625 | 87.692 |
| 0.8069444444444445 | 87.692 |
| 0.8076388888888889 | 83.205 |
| 0.8083333333333332 | 83.205 |
| 0.8090277777777778 | 83.205 |
| 0.8097222222222222 | 83.205 |
| 0.8104166666666667 | 78.722 |
| 0.811111111111111 | 78.722 |
| 0.8118055555555556 | 78.722 |
| 0.8125 | 74.246 |
| 0.8131944444444444 | 74.246 |
| 0.813888888888889 | 74.246 |
| 0.8145833333333333 | 74.246 |
| 0.8152777777777778 | 74.246 |
| 0.8159722222222222 | 69.775 |
| 0.8166666666666668 | 69.775 |
| 0.8173611111111111 | 69.775 |
| 0.8180555555555555 | 69.775 |
| 0.81875 | 65.31 |
| 0.8194444444444445 | 65.31 |
| 0.8201388888888889 | 65.31 |
| 0.8208333333333333 | 65.31 |
| 0.8215277777777777 | 60.85 |
| 0.8222222222222223 | 60.85 |
| 0.8229166666666666 | 60.85 |
| 0.8236111111111111 | 60.85 |
| 0.8243055555555556 | 56.398 |
| 0.8250000000000001 | 56.398 |
| 0.8256944444444444 | 56.398 |
| 0.8263888888888888 | 56.398 |
| 0.8270833333333334 | 51.951 |
| 0.8277777777777778 | 51.951 |
| 0.8284722222222222 | 51.951 |
| 0.8291666666666666 | 47.511 |
| 0.8298611111111112 | 47.511 |
| 0.8305555555555556 | 47.511 |
| 0.8312499999999999 | 47.511 |
| 0.8319444444444444 | 43.079 |
| 0.8326388888888889 | 43.079 |
| 0.8333333333333334 | 43.079 |
| 0.8340277777777777 | 43.079 |
| 0.8347222222222223 | 38.653 |
| 0.8354166666666667 | 38.653 |
| 0.8361111111111111 | 38.653 |
| 0.8368055555555555 | 38.653 |
| 0.8375 | 34.234 |
| 0.8381944444444445 | 34.234 |
| 0.8388888888888889 | 34.234 |
| 0.8395833333333332 | 34.234 |
| 0.8402777777777778 | 29.823 |
| 0.8409722222222222 | 29.823 |
| 0.8416666666666667 | 29.823 |
| 0.842361111111111 | 29.823 |
| 0.8430555555555556 | 25.419 |
| 0.84375 | 25.419 |
| 0.8444444444444444 | 25.419 |
| 0.845138888888889 | 21.024 |
| 0.8458333333333333 | 21.024 |
| 0.8465277777777778 | 16.636 |
| 0.8472222222222222 | 16.636 |
| 0.8479166666666668 | 16.636 |
| 0.8486111111111111 | 12.257 |
| 0.8493055555555555 | 12.257 |
| 0.85 | 12.257 |
| 0.8506944444444445 | 12.257 |
| 0.8513888888888889 | 7.887 |
| 0.8520833333333333 | 7.887 |
| 0.8527777777777777 | 7.887 |
| 0.8534722222222223 | 7.887 |
| 0.8541666666666666 | 3.525 |
| 0.8548611111111111 | 3.525 |
| 0.8555555555555556 | 3.525 |
| 0.8562500000000001 | 3.525 |
| 0.8569444444444444 | 3.525 |
| 0.8576388888888888 | 3.525 |
| 0.8583333333333334 | 3.525 |
| 0.8590277777777778 | 3.525 |
| 0.8597222222222222 | 0 |
| 0.8604166666666666 | 0 |
| 0.8611111111111112 | 0 |
| 0.8618055555555556 | 0 |
| 0.8624999999999999 | 0 |
| 0.8631944444444444 | 0 |
| 0.8638888888888889 | 0 |
| 0.8645833333333334 | 0 |
| 0.8652777777777777 | 0 |
| 0.8659722222222223 | 0 |
| 0.8666666666666667 | 0 |
| 0.8673611111111111 | 0 |
| 0.8680555555555555 | 0 |
| 0.86875 | 0 |
| 0.8694444444444445 | 0 |
| 0.8701388888888889 | 0 |
| 0.8708333333333332 | 0 |
| 0.8715277777777778 | 0 |
| 0.8722222222222222 | 0 |
| 0.8729166666666667 | 0 |
| 0.873611111111111 | 0 |
| 0.8743055555555556 | 0 |
| 0.875 | 0 |
| 0.8756944444444444 | 0 |
| 0.876388888888889 | 0 |
| 0.8770833333333333 | 0 |
| 0.8777777777777778 | 0 |
| 0.8784722222222222 | 0 |
| 0.8791666666666668 | 0 |
| 0.8798611111111111 | 0 |
| 0.8805555555555555 | 0 |
| 0.88125 | 0 |
| 0.8819444444444445 | 0 |
| 0.8826388888888889 | 0 |
| 0.8833333333333333 | 0 |
| 0.8840277777777777 | 0 |
| 0.8847222222222223 | 0 |
| 0.8854166666666666 | 0 |
| 0.8861111111111111 | 0 |
| 0.8868055555555556 | 0 |
| 0.8875000000000001 | 0 |
| 0.8881944444444444 | 0 |
| 0.8888888888888888 | 0 |
| 0.8895833333333334 | 0 |
| 0.8902777777777778 | 0 |
| 0.8909722222222222 | 0 |
| 0.8916666666666666 | 0 |
| 0.8923611111111112 | 0 |
| 0.8930555555555556 | 0 |
| 0.8937499999999999 | 0 |
| 0.8944444444444444 | 0 |
| 0.8951388888888889 | 0 |
| 0.8958333333333334 | 0 |
| 0.8965277777777777 | 0 |
| 0.8972222222222223 | 0 |
| 0.8979166666666667 | 0 |
| 0.8986111111111111 | 0 |
| 0.8993055555555555 | 0 |
| 0.9 | 0 |
| 0.9006944444444445 | 0 |
| 0.9013888888888889 | 0 |
| 0.9020833333333332 | 0 |
| 0.9027777777777778 | 0 |
| 0.9034722222222222 | 0 |
| 0.9041666666666667 | 0 |
| 0.904861111111111 | 0 |
| 0.9055555555555556 | 0 |
| 0.90625 | 0 |
| 0.9069444444444444 | 0 |
| 0.907638888888889 | 0 |
| 0.9083333333333333 | 0 |
| 0.9090277777777778 | 0 |
| 0.9097222222222222 | 0 |
| 0.9104166666666668 | 0 |
| 0.9111111111111111 | 0 |
| 0.9118055555555555 | 0 |
| 0.9125 | 0 |
| 0.9131944444444445 | 0 |
| 0.9138888888888889 | 0 |
| 0.9145833333333333 | 0 |
| 0.9152777777777777 | 0 |
| 0.9159722222222223 | 0 |
| 0.9166666666666666 | 0 |
| 0.9173611111111111 | 0 |
| 0.9180555555555556 | 0 |
| 0.9187500000000001 | 0 |
| 0.9194444444444444 | 0 |
| 0.9201388888888888 | 0 |
| 0.9208333333333334 | 0 |
| 0.9215277777777778 | 0 |
| 0.9222222222222222 | 0 |
| 0.9229166666666666 | 0 |
| 0.9236111111111112 | 0 |
| 0.9243055555555556 | 0 |
| 0.9249999999999999 | 0 |
| 0.9256944444444444 | 0 |
| 0.9263888888888889 | 0 |
| 0.9270833333333334 | 0 |
| 0.9277777777777777 | 0 |
| 0.9284722222222223 | 0 |
| 0.9291666666666667 | 0 |
| 0.9298611111111111 | 0 |
| 0.9305555555555555 | 0 |
| 0.93125 | 0 |
| 0.9319444444444445 | 0 |
| 0.9326388888888889 | 0 |
| 0.9333333333333332 | 0 |
| 0.9340277777777778 | 0 |
| 0.9347222222222222 | 0 |
| 0.9354166666666667 | 0 |
| 0.936111111111111 | 0 |
| 0.9368055555555556 | 0 |
| 0.9375 | 0 |
| 0.9381944444444444 | 0 |
| 0.938888888888889 | 0 |
| 0.9395833333333333 | 0 |
| 0.9402777777777778 | 0 |
| 0.9409722222222222 | 0 |
| 0.9416666666666668 | 0 |
| 0.9423611111111111 | 0 |
| 0.9430555555555555 | 0 |
| 0.94375 | 0 |
| 0.9444444444444445 | 0 |
| 0.9451388888888889 | 0 |
| 0.9458333333333333 | 0 |
| 0.9465277777777777 | 0 |
| 0.9472222222222223 | 0 |
| 0.9479166666666666 | 0 |
| 0.9486111111111111 | 0 |
| 0.9493055555555556 | 0 |
| 0.9500000000000001 | 0 |
| 0.9506944444444444 | 0 |
| 0.9513888888888888 | 0 |
| 0.9520833333333334 | 0 |
| 0.9527777777777778 | 0 |
| 0.9534722222222222 | 0 |
| 0.9541666666666666 | 0 |
| 0.9548611111111112 | 0 |
| 0.9555555555555556 | 0 |
| 0.9562499999999999 | 0 |
| 0.9569444444444444 | 0 |
| 0.9576388888888889 | 0 |
| 0.9583333333333334 | 0 |
| 0.9590277777777777 | 0 |
| 0.9597222222222223 | 0 |
| 0.9604166666666667 | 0 |
| 0.9611111111111111 | 0 |
| 0.9618055555555555 | 0 |
| 0.9625 | 0 |
| 0.9631944444444445 | 0 |
| 0.9638888888888889 | 0 |
| 0.9645833333333332 | 0 |
| 0.9652777777777778 | 0 |
| 0.9659722222222222 | 0 |
| 0.9666666666666667 | 0 |
| 0.967361111111111 | 0 |
| 0.9680555555555556 | 0 |
| 0.96875 | 0 |
| 0.9694444444444444 | 0 |
| 0.970138888888889 | 0 |
| 0.9708333333333333 | 0 |
| 0.9715277777777778 | 0 |
| 0.9722222222222222 | 0 |
| 0.9729166666666668 | 0 |
| 0.9736111111111111 | 0 |
| 0.9743055555555555 | 0 |
| 0.975 | 0 |
| 0.9756944444444445 | 0 |
| 0.9763888888888889 | 0 |
| 0.9770833333333333 | 0 |
| 0.9777777777777777 | 0 |
| 0.9784722222222223 | 0 |
| 0.9791666666666666 | 0 |
| 0.9798611111111111 | 0 |
| 0.9805555555555556 | 0 |
| 0.9812500000000001 | 0 |
| 0.9819444444444444 | 0 |
| 0.9826388888888888 | 0 |
| 0.9833333333333334 | 0 |
| 0.9840277777777778 | 0 |
| 0.9847222222222222 | 0 |
| 0.9854166666666666 | 0 |
| 0.9861111111111112 | 0 |
| 0.9868055555555556 | 0 |
| 0.9874999999999999 | 0 |
| 0.9881944444444444 | 0 |
| 0.9888888888888889 | 0 |
| 0.9895833333333334 | 0 |
| 0.9902777777777777 | 0 |
| 0.9909722222222223 | 0 |
| 0.9916666666666667 | 0 |
| 0.9923611111111111 | 0 |
| 0.9930555555555555 | 0 |
| 0.99375 | 0 |
| 0.9944444444444445 | 0 |
| 0.9951388888888889 | 0 |
| 0.9958333333333332 | 0 |
| 0.9965277777777778 | 0 |
| 0.9972222222222222 | 0 |
| 0.9979166666666667 | 0 |
| 0.998611111111111 | 0 |
| 0.9993055555555556 | 0 |